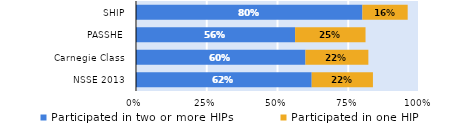
| Category | Participated in two or more HIPs | Participated in one HIP |
|---|---|---|
| NSSE 2013 | 0.621 | 0.216 |
| Carnegie Class | 0.599 | 0.222 |
| PASSHE | 0.562 | 0.249 |
| SHIP | 0.8 | 0.16 |